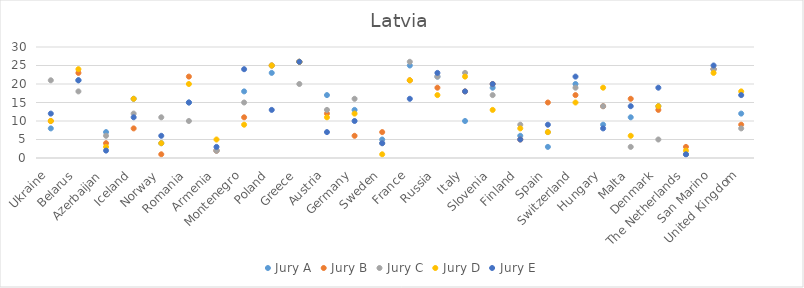
| Category | Jury A | Jury B | Jury C | Jury D | Jury E |
|---|---|---|---|---|---|
| Ukraine | 8 | 10 | 21 | 10 | 12 |
| Belarus | 21 | 23 | 18 | 24 | 21 |
| Azerbaijan | 7 | 4 | 6 | 3 | 2 |
| Iceland | 16 | 8 | 12 | 16 | 11 |
| Norway | 4 | 1 | 11 | 4 | 6 |
| Romania | 15 | 22 | 10 | 20 | 15 |
| Armenia | 2 | 2 | 2 | 5 | 3 |
| Montenegro | 18 | 11 | 15 | 9 | 24 |
| Poland | 23 | 25 | 25 | 25 | 13 |
| Greece | 26 | 26 | 20 | 26 | 26 |
| Austria | 17 | 12 | 13 | 11 | 7 |
| Germany | 13 | 6 | 16 | 12 | 10 |
| Sweden | 5 | 7 | 4 | 1 | 4 |
| France | 25 | 21 | 26 | 21 | 16 |
| Russia | 22 | 19 | 22 | 17 | 23 |
| Italy | 10 | 18 | 23 | 22 | 18 |
| Slovenia | 19 | 20 | 17 | 13 | 20 |
| Finland | 6 | 5 | 9 | 8 | 5 |
| Spain | 3 | 15 | 7 | 7 | 9 |
| Switzerland | 20 | 17 | 19 | 15 | 22 |
| Hungary | 9 | 14 | 14 | 19 | 8 |
| Malta | 11 | 16 | 3 | 6 | 14 |
| Denmark | 14 | 13 | 5 | 14 | 19 |
| The Netherlands | 1 | 3 | 1 | 2 | 1 |
| San Marino | 24 | 24 | 24 | 23 | 25 |
| United Kingdom | 12 | 9 | 8 | 18 | 17 |